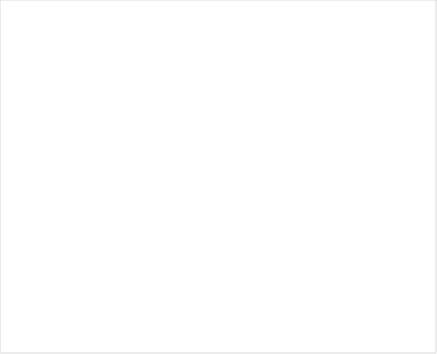
| Category | Total |
|---|---|
| 😁 | 55 |
| 🙂 | 37 |
| 😐
 | 14 |
| ☹️ | 11 |